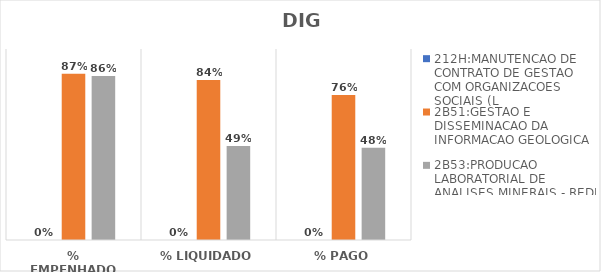
| Category | 212H:MANUTENCAO DE CONTRATO DE GESTAO COM ORGANIZACOES SOCIAIS (L | 2B51:GESTAO E DISSEMINACAO DA INFORMACAO GEOLOGICA | 2B53:PRODUCAO LABORATORIAL DE ANALISES MINERAIS - REDE LAMIN |
|---|---|---|---|
| % EMPENHADO | 0 | 0.871 | 0.859 |
| % LIQUIDADO | 0 | 0.838 | 0.492 |
| % PAGO | 0 | 0.759 | 0.482 |